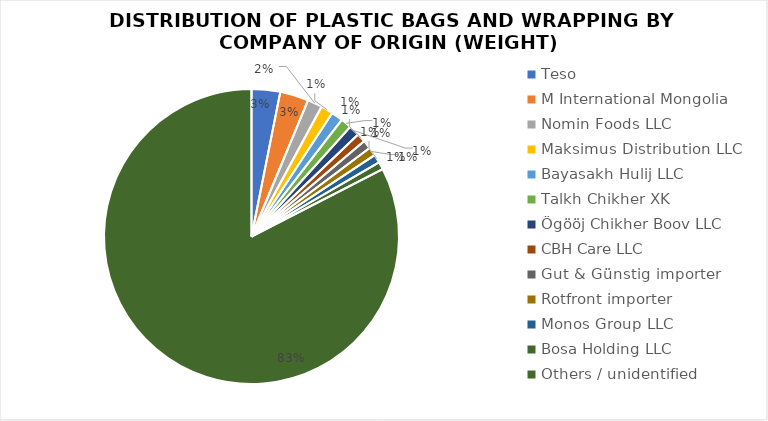
| Category | Series 0 |
|---|---|
| Teso | 5.438 |
| M International Mongolia | 5.438 |
| Nomin Foods LLC | 2.81 |
| Maksimus Distribution LLC | 2.336 |
| Bayasakh Hulij LLC | 2.19 |
| Talkh Chikher XK | 2.08 |
| Ögööj Chikher Boov LLC | 2.044 |
| CBH Care LLC | 1.679 |
| Gut & Günstig importer | 1.642 |
| Rotfront importer | 1.642 |
| Monos Group LLC | 1.57 |
| Bosa Holding LLC | 1.46 |
| Others / unidentified | 143.487 |